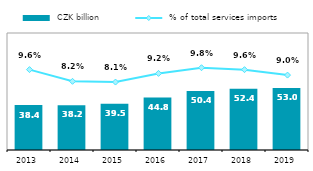
| Category |  CZK billion |
|---|---|
| 2013.0 | 38.382 |
| 2014.0 | 38.232 |
| 2015.0 | 39.517 |
| 2016.0 | 44.807 |
| 2017.0 | 50.389 |
| 2018.0 | 52.446 |
| 2019.0 | 53.04 |